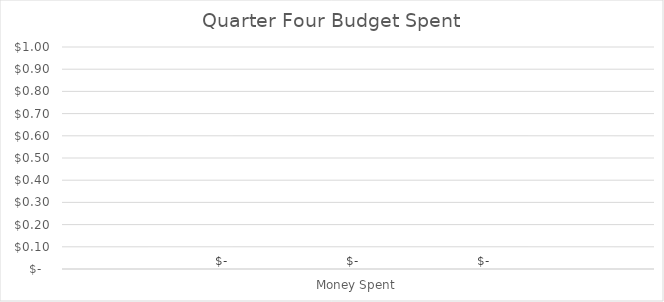
| Category | October Budget | November Budget | December Budget |
|---|---|---|---|
| 0 | 0 | 0 | 0 |